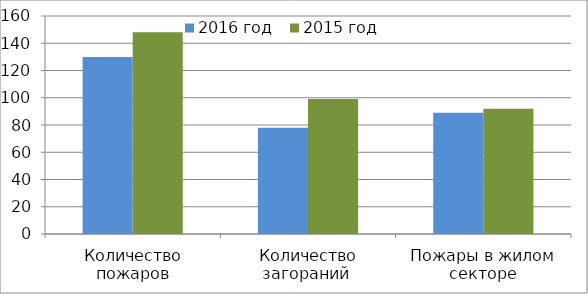
| Category | 2016 год | 2015 год |
|---|---|---|
| Количество пожаров | 130 | 148 |
| Количество загораний  | 78 | 99 |
| Пожары в жилом секторе | 89 | 92 |